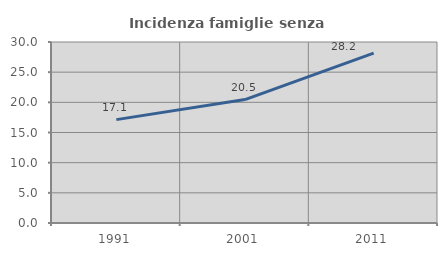
| Category | Incidenza famiglie senza nuclei |
|---|---|
| 1991.0 | 17.133 |
| 2001.0 | 20.461 |
| 2011.0 | 28.169 |